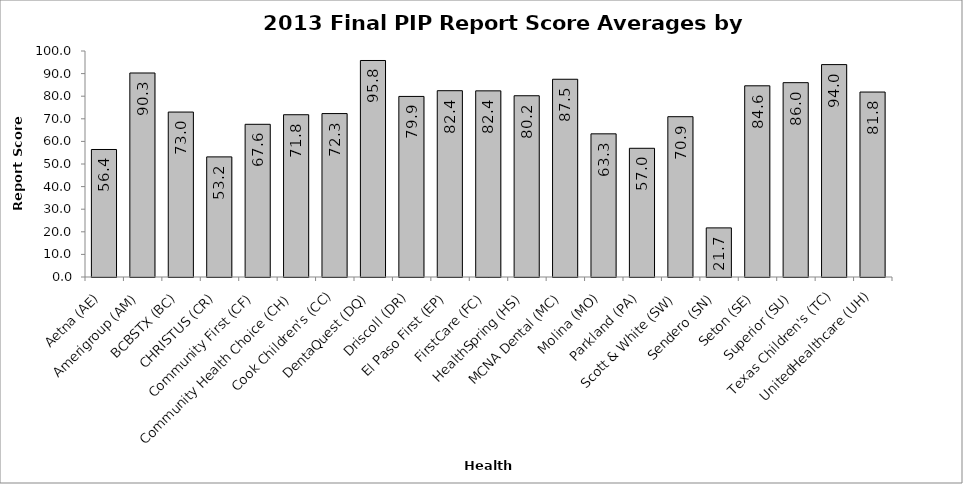
| Category | 2013 Final PIP Report Score Averages by Plan 2013 Final PIP Report Score Averages |
|---|---|
| Aetna (AE) | 56.417 |
| Amerigroup (AM) | 90.267 |
| BCBSTX (BC) | 72.983 |
| CHRISTUS (CR) | 53.15 |
| Community First (CF) | 67.567 |
| Community Health Choice (CH) | 71.8 |
| Cook Children's (CC) | 72.317 |
| DentaQuest (DQ) | 95.8 |
| Driscoll (DR) | 79.9 |
| El Paso First (EP) | 82.433 |
| FirstCare (FC) | 82.367 |
| HealthSpring (HS) | 80.2 |
| MCNA Dental (MC) | 87.5 |
| Molina (MO) | 63.344 |
| Parkland (PA) | 56.95 |
| Scott & White (SW) | 70.933 |
| Sendero (SN) | 21.733 |
| Seton (SE) | 84.6 |
| Superior (SU) | 85.992 |
| Texas Children's (TC) | 93.983 |
| UnitedHealthcare (UH) | 81.844 |